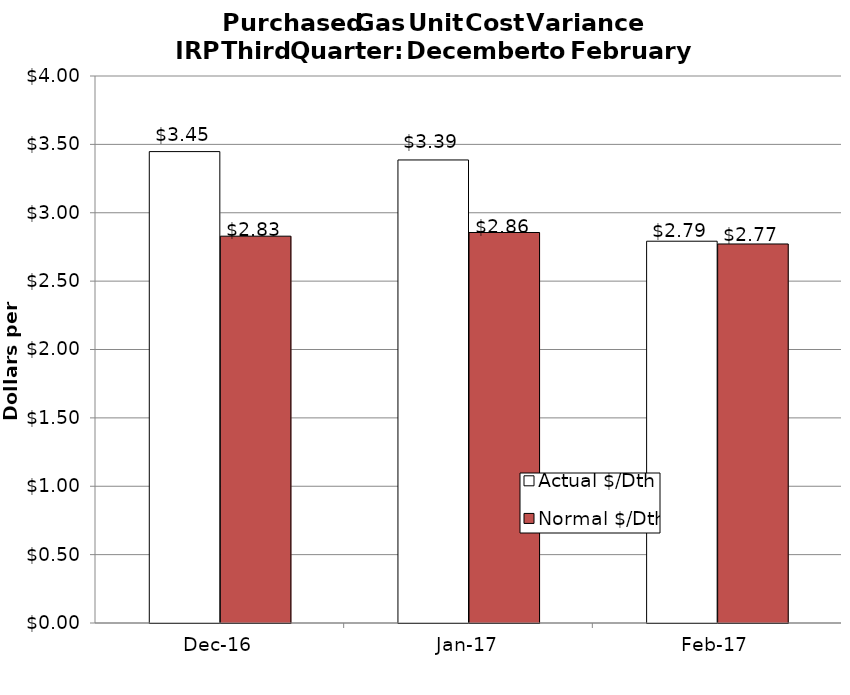
| Category | Actual $/Dth | Normal $/Dth |
|---|---|---|
| 2016-12-01 | 3.447 | 2.829 |
| 2017-01-01 | 3.386 | 2.856 |
| 2017-02-01 | 2.792 | 2.772 |